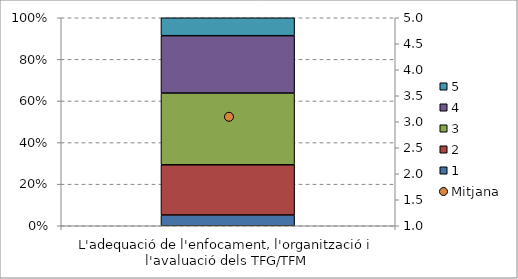
| Category | 1 | 2 | 3 | 4 | 5 |
|---|---|---|---|---|---|
| L'adequació de l'enfocament, l'organització i l'avaluació dels TFG/TFM | 3 | 14 | 20 | 16 | 5 |